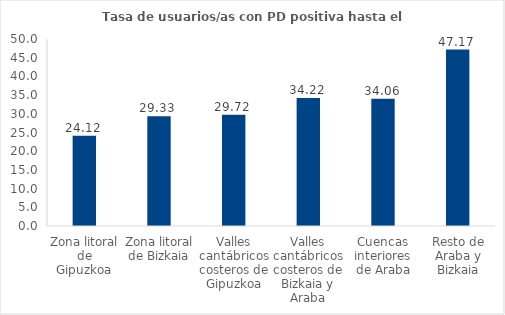
| Category | Series 0 |
|---|---|
| Zona litoral de Gipuzkoa | 24.123 |
| Zona litoral de Bizkaia | 29.327 |
| Valles cantábricos costeros de Gipuzkoa | 29.723 |
| Valles cantábricos costeros de Bizkaia y Araba | 34.224 |
| Cuencas interiores de Araba | 34.056 |
| Resto de Araba y Bizkaia | 47.167 |